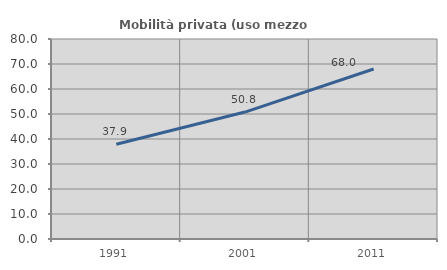
| Category | Mobilità privata (uso mezzo privato) |
|---|---|
| 1991.0 | 37.879 |
| 2001.0 | 50.769 |
| 2011.0 | 68 |